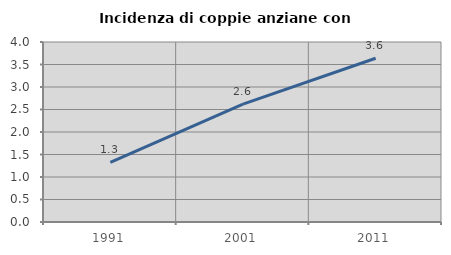
| Category | Incidenza di coppie anziane con figli |
|---|---|
| 1991.0 | 1.324 |
| 2001.0 | 2.62 |
| 2011.0 | 3.638 |